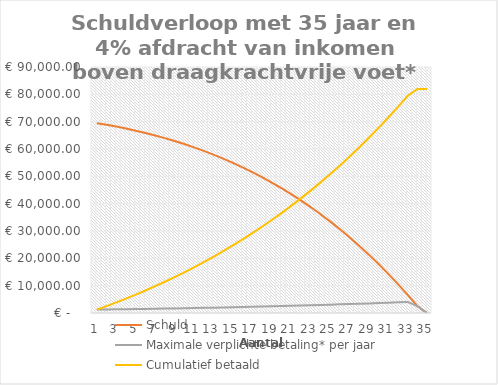
| Category | Schuld | Maximale verplichte betaling* per jaar | Cumulatief betaald |
|---|---|---|---|
| 0 | 69457.425 | 1242.575 | 1242.575 |
| 1 | 68859.852 | 1292.147 | 2534.722 |
| 2 | 68205 | 1343.451 | 3878.173 |
| 3 | 67490.504 | 1396.546 | 5274.719 |
| 4 | 66713.92 | 1451.489 | 6726.208 |
| 5 | 65872.718 | 1508.341 | 8234.549 |
| 6 | 64964.28 | 1567.165 | 9801.714 |
| 7 | 63985.897 | 1628.026 | 11429.74 |
| 8 | 62934.767 | 1690.989 | 13120.729 |
| 9 | 61807.992 | 1756.123 | 14876.851 |
| 10 | 60602.573 | 1823.499 | 16700.351 |
| 11 | 59315.407 | 1893.191 | 18593.542 |
| 12 | 57943.289 | 1965.273 | 20558.815 |
| 13 | 56482.898 | 2039.823 | 22598.638 |
| 14 | 54930.805 | 2116.922 | 24715.56 |
| 15 | 53283.462 | 2196.652 | 26912.212 |
| 16 | 51537.199 | 2279.098 | 29191.309 |
| 17 | 49688.223 | 2364.348 | 31555.657 |
| 18 | 47732.612 | 2452.493 | 34008.15 |
| 19 | 45666.311 | 2543.627 | 36551.778 |
| 20 | 43485.127 | 2637.846 | 39189.624 |
| 21 | 41184.728 | 2735.25 | 41924.874 |
| 22 | 38760.634 | 2835.942 | 44760.816 |
| 23 | 36208.213 | 2940.027 | 47700.843 |
| 24 | 33522.681 | 3047.614 | 50748.458 |
| 25 | 30699.09 | 3158.817 | 53907.275 |
| 26 | 27732.329 | 3273.752 | 57181.027 |
| 27 | 24617.115 | 3392.538 | 60573.565 |
| 28 | 21347.987 | 3515.299 | 64088.864 |
| 29 | 17919.304 | 3642.162 | 67731.026 |
| 30 | 14325.237 | 3773.26 | 71504.286 |
| 31 | 10559.762 | 3908.727 | 75413.013 |
| 32 | 6616.656 | 4048.704 | 79461.717 |
| 33 | 2489.489 | 2489.489 | 81951.206 |
| 34 | 0 | 0 | 81951.206 |